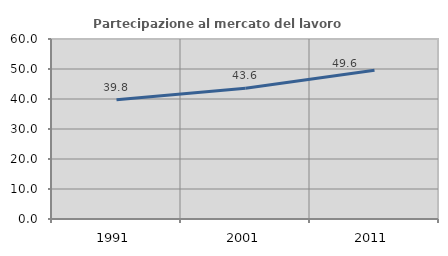
| Category | Partecipazione al mercato del lavoro  femminile |
|---|---|
| 1991.0 | 39.774 |
| 2001.0 | 43.612 |
| 2011.0 | 49.566 |